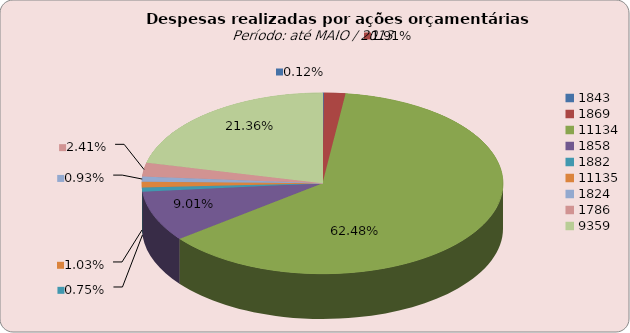
| Category | Series 1 |
|---|---|
| 1843.0 | 81117.02 |
| 1869.0 | 1292639.23 |
| 11134.0 | 42194209.76 |
| 1858.0 | 6081745.58 |
| 1882.0 | 503655.42 |
| 11135.0 | 696443.41 |
| 1824.0 | 626888.23 |
| 1786.0 | 1630749.21 |
| 9359.0 | 14429162.72 |